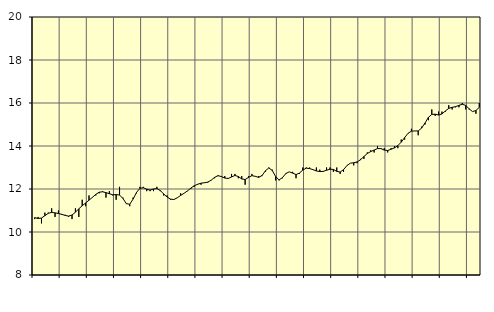
| Category | Piggar | Utbildning, SNI 85 |
|---|---|---|
| nan | 10.6 | 10.67 |
| 87.0 | 10.7 | 10.63 |
| 87.0 | 10.4 | 10.65 |
| 87.0 | 10.9 | 10.76 |
| nan | 10.9 | 10.87 |
| 88.0 | 11.1 | 10.91 |
| 88.0 | 10.7 | 10.89 |
| 88.0 | 11 | 10.86 |
| nan | 10.8 | 10.82 |
| 89.0 | 10.8 | 10.77 |
| 89.0 | 10.7 | 10.74 |
| 89.0 | 10.6 | 10.79 |
| nan | 11.1 | 10.92 |
| 90.0 | 10.7 | 11.08 |
| 90.0 | 11.5 | 11.22 |
| 90.0 | 11.2 | 11.35 |
| nan | 11.7 | 11.48 |
| 91.0 | 11.6 | 11.61 |
| 91.0 | 11.7 | 11.75 |
| 91.0 | 11.8 | 11.85 |
| nan | 11.9 | 11.87 |
| 92.0 | 11.6 | 11.83 |
| 92.0 | 11.9 | 11.78 |
| 92.0 | 11.7 | 11.73 |
| nan | 11.5 | 11.74 |
| 93.0 | 12.1 | 11.72 |
| 93.0 | 11.6 | 11.56 |
| 93.0 | 11.3 | 11.32 |
| nan | 11.2 | 11.29 |
| 94.0 | 11.6 | 11.53 |
| 94.0 | 11.8 | 11.84 |
| 94.0 | 12.1 | 12.03 |
| nan | 12.1 | 12.06 |
| 95.0 | 11.9 | 11.99 |
| 95.0 | 11.9 | 11.95 |
| 95.0 | 11.9 | 12 |
| nan | 12.1 | 12.02 |
| 96.0 | 11.9 | 11.93 |
| 96.0 | 11.7 | 11.77 |
| 96.0 | 11.7 | 11.63 |
| nan | 11.5 | 11.53 |
| 97.0 | 11.5 | 11.51 |
| 97.0 | 11.6 | 11.59 |
| 97.0 | 11.8 | 11.7 |
| nan | 11.8 | 11.8 |
| 98.0 | 11.9 | 11.91 |
| 98.0 | 12 | 12.04 |
| 98.0 | 12.1 | 12.15 |
| nan | 12.2 | 12.22 |
| 99.0 | 12.2 | 12.27 |
| 99.0 | 12.3 | 12.29 |
| 99.0 | 12.3 | 12.32 |
| nan | 12.4 | 12.41 |
| 0.0 | 12.5 | 12.54 |
| 0.0 | 12.6 | 12.62 |
| 0.0 | 12.6 | 12.58 |
| nan | 12.6 | 12.51 |
| 1.0 | 12.5 | 12.49 |
| 1.0 | 12.7 | 12.56 |
| 1.0 | 12.7 | 12.63 |
| nan | 12.5 | 12.58 |
| 2.0 | 12.6 | 12.47 |
| 2.0 | 12.2 | 12.44 |
| 2.0 | 12.6 | 12.54 |
| nan | 12.7 | 12.62 |
| 3.0 | 12.6 | 12.59 |
| 3.0 | 12.6 | 12.54 |
| 3.0 | 12.6 | 12.63 |
| nan | 12.8 | 12.85 |
| 4.0 | 13 | 12.98 |
| 4.0 | 12.9 | 12.86 |
| 4.0 | 12.4 | 12.58 |
| nan | 12.4 | 12.42 |
| 5.0 | 12.5 | 12.53 |
| 5.0 | 12.7 | 12.72 |
| 5.0 | 12.8 | 12.8 |
| nan | 12.8 | 12.74 |
| 6.0 | 12.5 | 12.67 |
| 6.0 | 12.7 | 12.74 |
| 6.0 | 13 | 12.88 |
| nan | 13 | 12.97 |
| 7.0 | 13 | 12.95 |
| 7.0 | 12.9 | 12.9 |
| 7.0 | 13 | 12.84 |
| nan | 12.9 | 12.81 |
| 8.0 | 12.8 | 12.82 |
| 8.0 | 13 | 12.87 |
| 8.0 | 13 | 12.92 |
| nan | 12.8 | 12.91 |
| 9.0 | 13 | 12.82 |
| 9.0 | 12.7 | 12.79 |
| 9.0 | 12.8 | 12.9 |
| nan | 13.1 | 13.09 |
| 10.0 | 13.2 | 13.2 |
| 10.0 | 13.1 | 13.22 |
| 10.0 | 13.2 | 13.26 |
| nan | 13.4 | 13.36 |
| 11.0 | 13.4 | 13.51 |
| 11.0 | 13.7 | 13.65 |
| 11.0 | 13.8 | 13.74 |
| nan | 13.7 | 13.81 |
| 12.0 | 14 | 13.88 |
| 12.0 | 13.9 | 13.88 |
| 12.0 | 13.9 | 13.81 |
| nan | 13.7 | 13.79 |
| 13.0 | 13.9 | 13.85 |
| 13.0 | 14 | 13.91 |
| 13.0 | 13.9 | 14.02 |
| nan | 14.3 | 14.18 |
| 14.0 | 14.3 | 14.39 |
| 14.0 | 14.6 | 14.59 |
| 14.0 | 14.8 | 14.69 |
| nan | 14.7 | 14.7 |
| 15.0 | 14.5 | 14.7 |
| 15.0 | 14.9 | 14.83 |
| 15.0 | 15 | 15.07 |
| nan | 15.2 | 15.33 |
| 16.0 | 15.7 | 15.47 |
| 16.0 | 15.4 | 15.48 |
| 16.0 | 15.6 | 15.44 |
| nan | 15.6 | 15.49 |
| 17.0 | 15.6 | 15.63 |
| 17.0 | 15.9 | 15.75 |
| 17.0 | 15.7 | 15.8 |
| nan | 15.8 | 15.83 |
| 18.0 | 15.8 | 15.89 |
| 18.0 | 16 | 15.94 |
| 18.0 | 15.7 | 15.89 |
| nan | 15.7 | 15.73 |
| 19.0 | 15.6 | 15.6 |
| 19.0 | 15.5 | 15.65 |
| 19.0 | 16 | 15.8 |